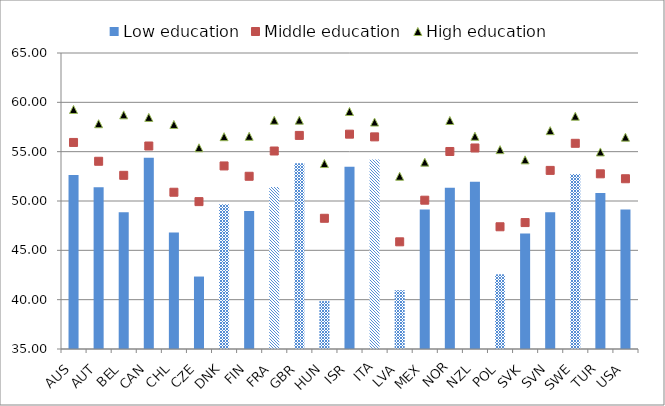
| Category | Low education |
|---|---|
| AUS | 52.633 |
| AUT | 51.402 |
| BEL | 48.87 |
| CAN | 54.388 |
| CHL | 46.819 |
| CZE | 42.343 |
| DNK | 49.673 |
| FIN | 48.979 |
| FRA | 51.419 |
| GBR | 53.838 |
| HUN | 39.854 |
| ISR | 53.462 |
| ITA | 54.2 |
| LVA | 40.96 |
| MEX | 49.139 |
| NOR | 51.335 |
| NZL | 51.939 |
| POL | 42.57 |
| SVK | 46.702 |
| SVN | 48.857 |
| SWE | 52.737 |
| TUR | 50.823 |
| USA | 49.144 |